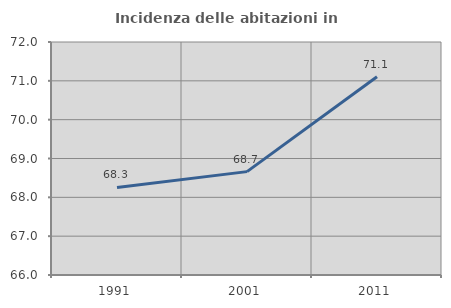
| Category | Incidenza delle abitazioni in proprietà  |
|---|---|
| 1991.0 | 68.254 |
| 2001.0 | 68.662 |
| 2011.0 | 71.104 |